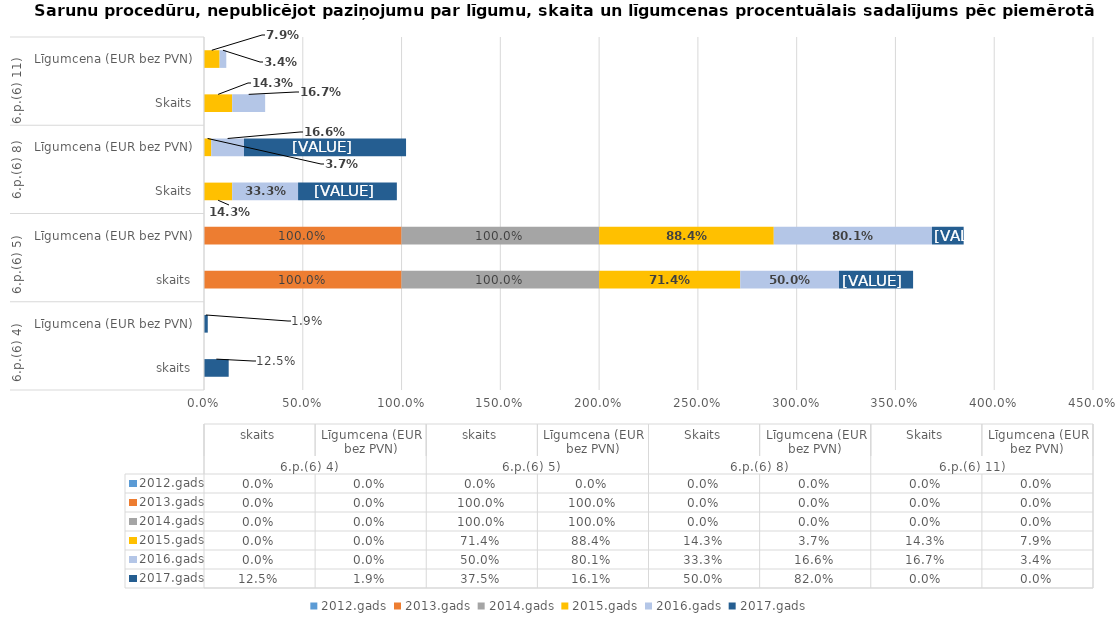
| Category | 2012.gads | 2013.gads | 2014.gads | 2015.gads | 2016.gads | 2017.gads |
|---|---|---|---|---|---|---|
| 0 | 0 | 0 | 0 | 0 | 0 | 0.125 |
| 1 | 0 | 0 | 0 | 0 | 0 | 0.019 |
| 2 | 0 | 1 | 1 | 0.714 | 0.5 | 0.375 |
| 3 | 0 | 1 | 1 | 0.884 | 0.801 | 0.161 |
| 4 | 0 | 0 | 0 | 0.143 | 0.333 | 0.5 |
| 5 | 0 | 0 | 0 | 0.037 | 0.166 | 0.82 |
| 6 | 0 | 0 | 0 | 0.143 | 0.167 | 0 |
| 7 | 0 | 0 | 0 | 0.079 | 0.034 | 0 |